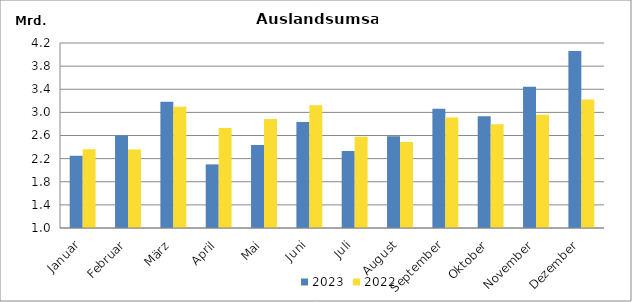
| Category | 2023 | 2022 |
|---|---|---|
| Januar | 2250185.315 | 2361333.075 |
| Februar | 2599382.042 | 2357999.874 |
| März | 3183961.073 | 3097720.559 |
| April | 2100397.818 | 2729432.509 |
| Mai | 2433625.719 | 2885386.501 |
| Juni | 2831625.263 | 3124481.13 |
| Juli | 2333488.798 | 2576766.456 |
| August | 2588768.945 | 2488380.227 |
| September | 3064177.892 | 2909640.571 |
| Oktober | 2933836.603 | 2794723.954 |
| November | 3444945.476 | 2960084.967 |
| Dezember | 4061705.083 | 3224506.283 |